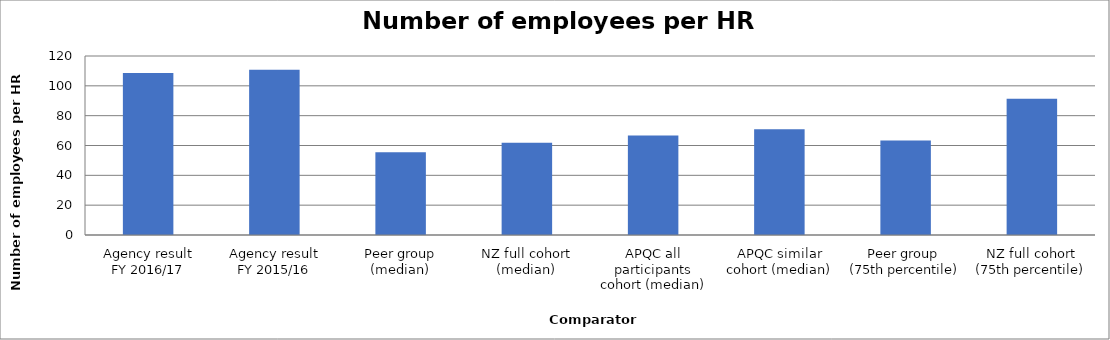
| Category | Result |
|---|---|
| Agency result
FY 2016/17 | 108.673 |
| Agency result
FY 2015/16 | 110.842 |
| Peer group (median) | 55.529 |
| NZ full cohort (median) | 61.804 |
| APQC all participants cohort (median) | 66.67 |
| APQC similar cohort (median) | 70.88 |
| Peer group 
(75th percentile) | 63.298 |
| NZ full cohort (75th percentile) | 91.294 |